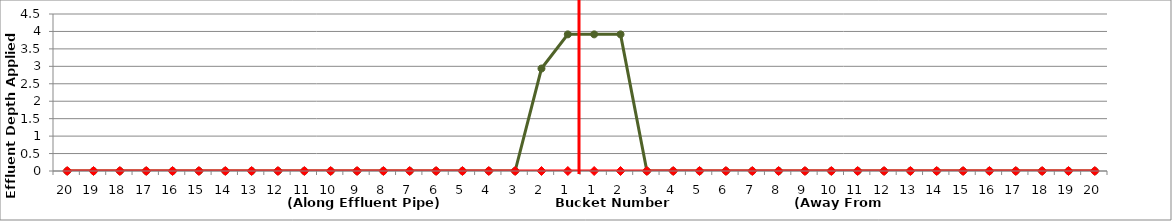
| Category | Series 3 | Series 0 |
|---|---|---|
| 20.0 | 0 | 0 |
| 19.0 | 0 | 0 |
| 18.0 | 0 | 0 |
| 17.0 | 0 | 0 |
| 16.0 | 0 | 0 |
| 15.0 | 0 | 0 |
| 14.0 | 0 | 0 |
| 13.0 | 0 | 0 |
| 12.0 | 0 | 0 |
| 11.0 | 0 | 0 |
| 10.0 | 0 | 0 |
| 9.0 | 0 | 0 |
| 8.0 | 0 | 0 |
| 7.0 | 0 | 0 |
| 6.0 | 0 | 0 |
| 5.0 | 0 | 0 |
| 4.0 | 0 | 0 |
| 3.0 | 0 | 0 |
| 2.0 | 2.937 | 0 |
| 1.0 | 3.916 | 0 |
| 1.0 | 3.916 | 0 |
| 2.0 | 3.916 | 0 |
| 3.0 | 0 | 0 |
| 4.0 | 0 | 0 |
| 5.0 | 0 | 0 |
| 6.0 | 0 | 0 |
| 7.0 | 0 | 0 |
| 8.0 | 0 | 0 |
| 9.0 | 0 | 0 |
| 10.0 | 0 | 0 |
| 11.0 | 0 | 0 |
| 12.0 | 0 | 0 |
| 13.0 | 0 | 0 |
| 14.0 | 0 | 0 |
| 15.0 | 0 | 0 |
| 16.0 | 0 | 0 |
| 17.0 | 0 | 0 |
| 18.0 | 0 | 0 |
| 19.0 | 0 | 0 |
| 20.0 | 0 | 0 |